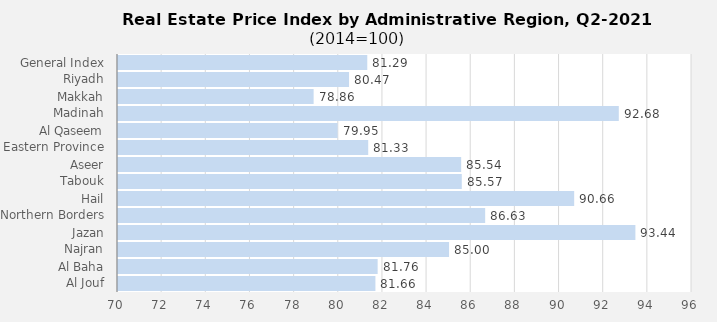
| Category | 2021 |
|---|---|
| General Index | 81.291 |
| Riyadh | 80.465 |
| Makkah | 78.861 |
| Madinah | 92.684 |
| Al Qaseem | 79.948 |
| Eastern Province | 81.333 |
| Aseer | 85.544 |
| Tabouk | 85.572 |
| Hail | 90.663 |
| Northern Borders | 86.631 |
| Jazan | 93.436 |
| Najran | 84.995 |
| Al Baha | 81.761 |
| Al Jouf | 81.66 |